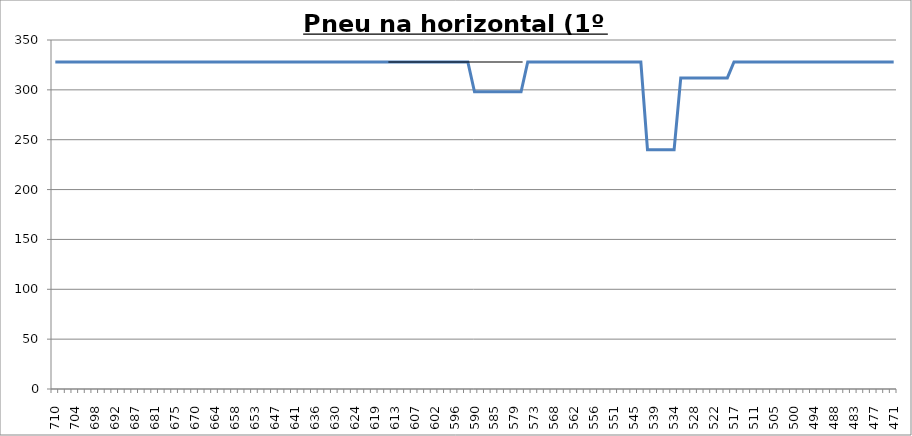
| Category | Series 0 |
|---|---|
| 710.0 | 328 |
| 708.0 | 328 |
| 706.0 | 328 |
| 704.0 | 328 |
| 702.0 | 328 |
| 700.0 | 328 |
| 698.0 | 328 |
| 696.0 | 328 |
| 694.0 | 328 |
| 692.0 | 328 |
| 691.0 | 328 |
| 689.0 | 328 |
| 687.0 | 328 |
| 685.0 | 328 |
| 683.0 | 328 |
| 681.0 | 328 |
| 679.0 | 328 |
| 677.0 | 328 |
| 675.0 | 328 |
| 674.0 | 328 |
| 672.0 | 328 |
| 670.0 | 328 |
| 668.0 | 328 |
| 666.0 | 328 |
| 664.0 | 328 |
| 662.0 | 328 |
| 660.0 | 328 |
| 658.0 | 328 |
| 657.0 | 328 |
| 655.0 | 328 |
| 653.0 | 328 |
| 651.0 | 328 |
| 649.0 | 328 |
| 647.0 | 328 |
| 645.0 | 328 |
| 643.0 | 328 |
| 641.0 | 328 |
| 640.0 | 328 |
| 638.0 | 328 |
| 636.0 | 328 |
| 634.0 | 328 |
| 632.0 | 328 |
| 630.0 | 328 |
| 628.0 | 328 |
| 626.0 | 328 |
| 624.0 | 328 |
| 623.0 | 328 |
| 621.0 | 328 |
| 619.0 | 328 |
| 617.0 | 328 |
| 615.0 | 328 |
| 613.0 | 328 |
| 611.0 | 328 |
| 609.0 | 328 |
| 607.0 | 328 |
| 606.0 | 328 |
| 604.0 | 328 |
| 602.0 | 328 |
| 600.0 | 328 |
| 598.0 | 328 |
| 596.0 | 328 |
| 594.0 | 328 |
| 592.0 | 328 |
| 590.0 | 298 |
| 589.0 | 298 |
| 587.0 | 298 |
| 585.0 | 298 |
| 583.0 | 298 |
| 581.0 | 298 |
| 579.0 | 298 |
| 577.0 | 298 |
| 575.0 | 328 |
| 573.0 | 328 |
| 572.0 | 328 |
| 570.0 | 328 |
| 568.0 | 328 |
| 566.0 | 328 |
| 564.0 | 328 |
| 562.0 | 328 |
| 560.0 | 328 |
| 558.0 | 328 |
| 556.0 | 328 |
| 555.0 | 328 |
| 553.0 | 328 |
| 551.0 | 328 |
| 549.0 | 328 |
| 547.0 | 328 |
| 545.0 | 328 |
| 543.0 | 328 |
| 541.0 | 240 |
| 539.0 | 240 |
| 538.0 | 240 |
| 536.0 | 240 |
| 534.0 | 240 |
| 532.0 | 312 |
| 530.0 | 312 |
| 528.0 | 312 |
| 526.0 | 312 |
| 524.0 | 312 |
| 522.0 | 312 |
| 521.0 | 312 |
| 519.0 | 312 |
| 517.0 | 328 |
| 515.0 | 328 |
| 513.0 | 328 |
| 511.0 | 328 |
| 509.0 | 328 |
| 507.0 | 328 |
| 505.0 | 328 |
| 504.0 | 328 |
| 502.0 | 328 |
| 500.0 | 328 |
| 498.0 | 328 |
| 496.0 | 328 |
| 494.0 | 328 |
| 492.0 | 328 |
| 490.0 | 328 |
| 488.0 | 328 |
| 487.0 | 328 |
| 485.0 | 328 |
| 483.0 | 328 |
| 481.0 | 328 |
| 479.0 | 328 |
| 477.0 | 328 |
| 475.0 | 328 |
| 473.0 | 328 |
| 471.0 | 328 |